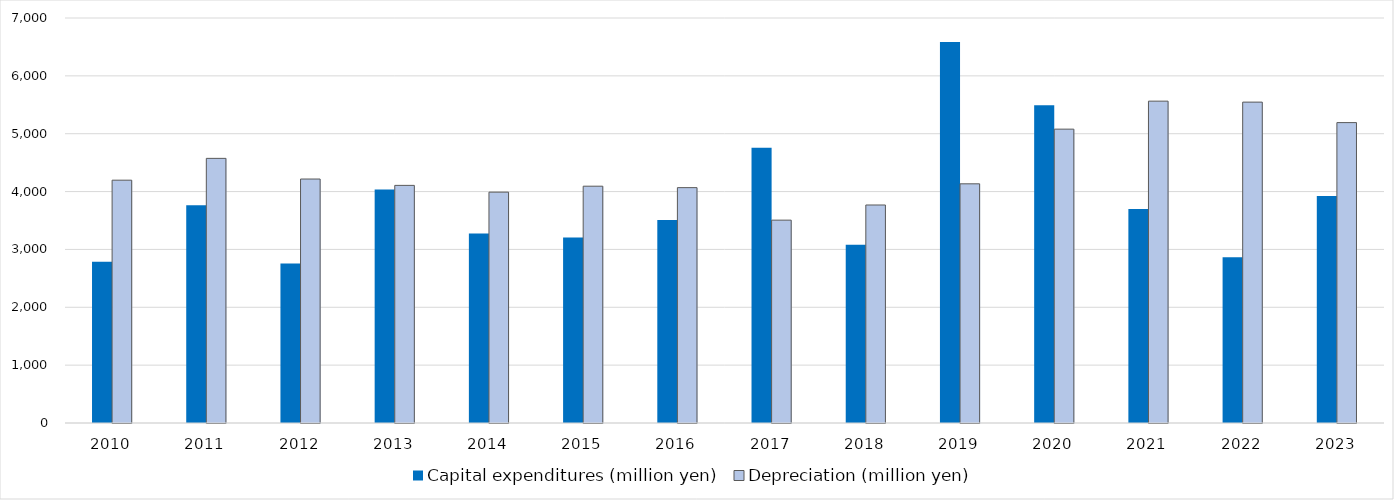
| Category | Capital expenditures (million yen) | Depreciation (million yen) |
|---|---|---|
| 2010 | 2785 | 4197 |
| 2011 | 3765 | 4574 |
| 2012 | 2758 | 4217 |
| 2013 | 4036 | 4107 |
| 2014 | 3274 | 3990 |
| 2015 | 3206 | 4093 |
| 2016 | 3508 | 4068 |
| 2017 | 4757 | 3506 |
| 2018 | 3081 | 3768 |
| 2019 | 6586 | 4134 |
| 2020 | 5490 | 5079 |
| 2021 | 3697 | 5563 |
| 2022 | 2864 | 5546 |
| 2023 | 3924 | 5192 |